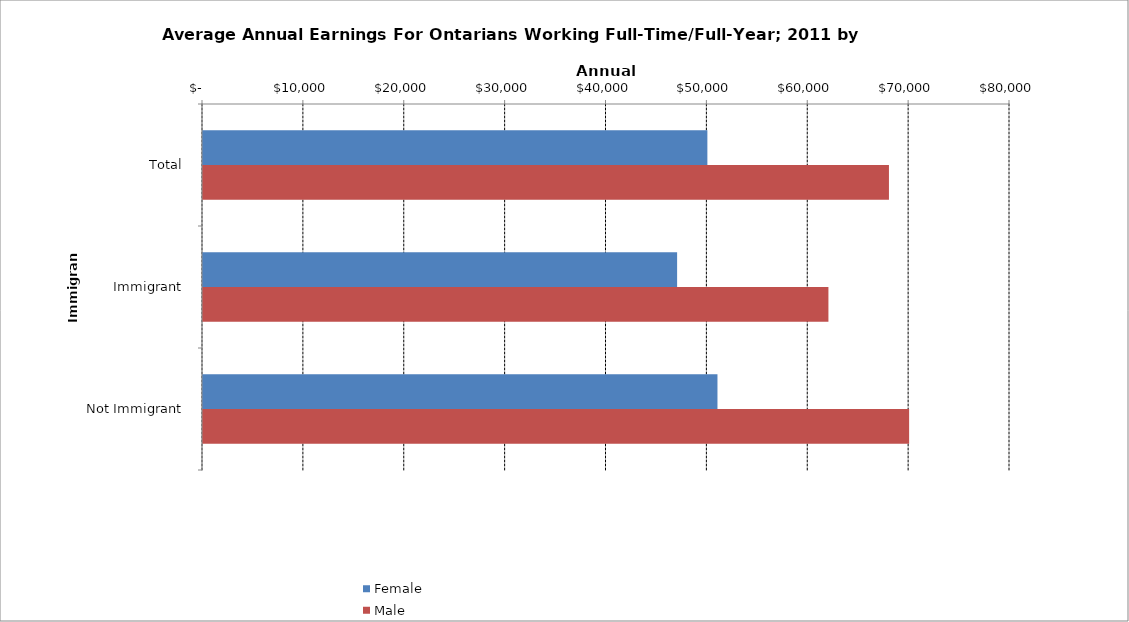
| Category | Female | Male |
|---|---|---|
| Total | 50000 | 68000 |
|  Immigrant  | 47000 | 62000 |
|  Not Immigrant  | 51000 | 70000 |